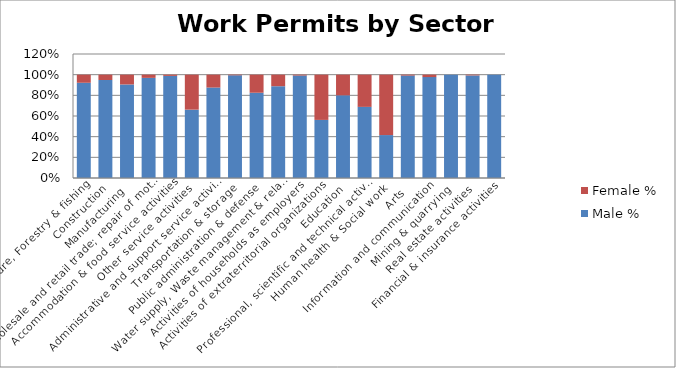
| Category | Male % | Female % |
|---|---|---|
| Agriculture, Forestry & fishing | 0.922 | 0.078 |
| Construction | 0.948 | 0.052 |
| Manufacturing | 0.905 | 0.095 |
| Wholesale and retail trade; repair of motor vehicles  | 0.969 | 0.031 |
| Accommodation & food service activities | 0.988 | 0.012 |
| Other service activities | 0.661 | 0.339 |
| Administrative and support service activities | 0.875 | 0.125 |
| Transportation & storage | 0.994 | 0.006 |
| Public administration & defense | 0.825 | 0.175 |
| Water supply, Waste management & related activities | 0.889 | 0.111 |
| Activities of households as employers | 0.992 | 0.008 |
| Activities of extraterritorial organizations  | 0.562 | 0.438 |
| Education | 0.8 | 0.2 |
| Professional, scientific and technical activities | 0.688 | 0.312 |
| Human health & Social work | 0.416 | 0.584 |
| Arts | 0.991 | 0.009 |
| Information and communication | 0.977 | 0.023 |
| Mining & quarrying | 1 | 0 |
| Real estate activities | 0.993 | 0.007 |
| Financial & insurance activities | 1 | 0 |